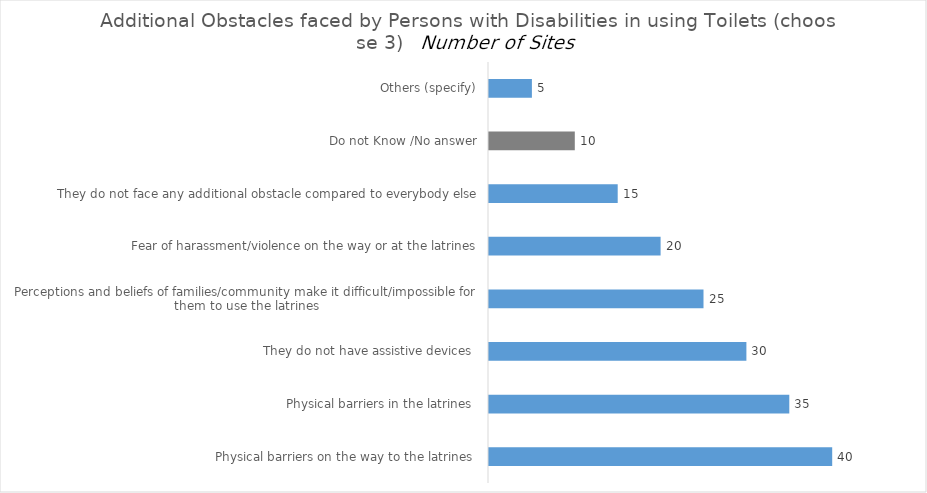
| Category | Additional Obstacles faced by Persons with Disabilities in using Toilets |
|---|---|
| Physical barriers on the way to the latrines  | 40 |
| Physical barriers in the latrines  | 35 |
| They do not have assistive devices  | 30 |
| Perceptions and beliefs of families/community make it difficult/impossible for them to use the latrines | 25 |
| Fear of harassment/violence on the way or at the latrines | 20 |
| They do not face any additional obstacle compared to everybody else | 15 |
| Do not Know /No answer | 10 |
| Others (specify) | 5 |